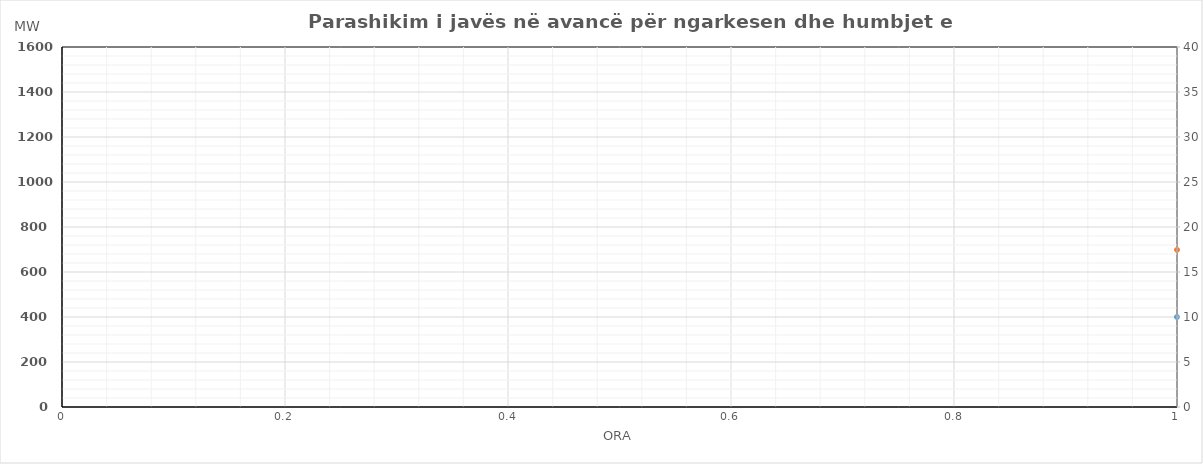
| Category | Ngarkesa (MWh) |
|---|---|
| 0 | 698.332 |
| 1 | 620.503 |
| 2 | 586.641 |
| 3 | 567.475 |
| 4 | 578.363 |
| 5 | 612.088 |
| 6 | 724.117 |
| 7 | 898.31 |
| 8 | 1083.979 |
| 9 | 1149.55 |
| 10 | 1149.061 |
| 11 | 1133.07 |
| 12 | 1152.724 |
| 13 | 1178.575 |
| 14 | 1182.587 |
| 15 | 1187.705 |
| 16 | 1000 |
| 17 | 1315.659 |
| 18 | 1380.381 |
| 19 | 1389.265 |
| 20 | 1352.901 |
| 21 | 1242.611 |
| 22 | 1057.441 |
| 23 | 846.953 |
| 24 | 788.974 |
| 25 | 672.019 |
| 26 | 610.827 |
| 27 | 590.645 |
| 28 | 594.026 |
| 29 | 652.233 |
| 30 | 795.953 |
| 31 | 1017.923 |
| 32 | 1188.043 |
| 33 | 1198.741 |
| 34 | 1155.874 |
| 35 | 1143.347 |
| 36 | 1123.387 |
| 37 | 1121.538 |
| 38 | 1111.923 |
| 39 | 1101.423 |
| 40 | 1145.661 |
| 41 | 1269.067 |
| 42 | 1342.408 |
| 43 | 1340.217 |
| 44 | 1298.548 |
| 45 | 1192.358 |
| 46 | 1023.491 |
| 47 | 832.591 |
| 48 | 715.553 |
| 49 | 639.66 |
| 50 | 606.757 |
| 51 | 594.966 |
| 52 | 598.819 |
| 53 | 664.195 |
| 54 | 837.34 |
| 55 | 1119.675 |
| 56 | 1206.264 |
| 57 | 1188.615 |
| 58 | 1128.336 |
| 59 | 1072.664 |
| 60 | 1040.82 |
| 61 | 1041.946 |
| 62 | 1042.054 |
| 63 | 1038.34 |
| 64 | 1081.554 |
| 65 | 1227.03 |
| 66 | 1322.581 |
| 67 | 1313.789 |
| 68 | 1295.478 |
| 69 | 1190.984 |
| 70 | 1070.475 |
| 71 | 915.374 |
| 72 | 734.51 |
| 73 | 654.649 |
| 74 | 612.786 |
| 75 | 598.158 |
| 76 | 612.997 |
| 77 | 683.121 |
| 78 | 867.23 |
| 79 | 1151.902 |
| 80 | 1244.96 |
| 81 | 1215.676 |
| 82 | 1153.607 |
| 83 | 1089.277 |
| 84 | 1059.447 |
| 85 | 1071.613 |
| 86 | 1082.143 |
| 87 | 1085.477 |
| 88 | 1126.088 |
| 89 | 1273.827 |
| 90 | 1380.758 |
| 91 | 1374.523 |
| 92 | 1341.607 |
| 93 | 1235.088 |
| 94 | 1085.69 |
| 95 | 877.384 |
| 96 | 698.332 |
| 97 | 620.503 |
| 98 | 586.641 |
| 99 | 567.475 |
| 100 | 578.363 |
| 101 | 612.088 |
| 102 | 724.117 |
| 103 | 898.31 |
| 104 | 1083.979 |
| 105 | 1149.55 |
| 106 | 1149.061 |
| 107 | 1133.07 |
| 108 | 1152.724 |
| 109 | 1178.575 |
| 110 | 1182.587 |
| 111 | 1187.705 |
| 112 | 1217.724 |
| 113 | 1315.659 |
| 114 | 1380.381 |
| 115 | 1389.265 |
| 116 | 1352.901 |
| 117 | 1242.611 |
| 118 | 1057.441 |
| 119 | 846.953 |
| 120 | 788.974 |
| 121 | 672.019 |
| 122 | 610.827 |
| 123 | 590.645 |
| 124 | 594.026 |
| 125 | 652.233 |
| 126 | 795.953 |
| 127 | 1017.923 |
| 128 | 1188.043 |
| 129 | 1198.741 |
| 130 | 1155.874 |
| 131 | 1143.347 |
| 132 | 1123.387 |
| 133 | 1121.538 |
| 134 | 1111.923 |
| 135 | 1101.423 |
| 136 | 1145.661 |
| 137 | 1269.067 |
| 138 | 1342.408 |
| 139 | 1340.217 |
| 140 | 1298.548 |
| 141 | 1192.358 |
| 142 | 1023.491 |
| 143 | 832.591 |
| 144 | 715.553 |
| 145 | 639.66 |
| 146 | 606.757 |
| 147 | 594.966 |
| 148 | 598.819 |
| 149 | 664.195 |
| 150 | 837.34 |
| 151 | 1119.675 |
| 152 | 1206.264 |
| 153 | 1188.615 |
| 154 | 1128.336 |
| 155 | 1072.664 |
| 156 | 1040.82 |
| 157 | 1041.946 |
| 158 | 1042.054 |
| 159 | 1038.34 |
| 160 | 1081.554 |
| 161 | 1227.03 |
| 162 | 1322.581 |
| 163 | 1313.789 |
| 164 | 1295.478 |
| 165 | 1190.984 |
| 166 | 1070.475 |
| 167 | 915.374 |